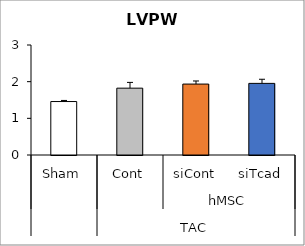
| Category | Series 0 |
|---|---|
| 0 | 1.458 |
| 1 | 1.823 |
| 2 | 1.934 |
| 3 | 1.953 |